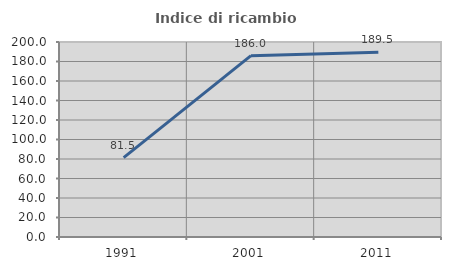
| Category | Indice di ricambio occupazionale  |
|---|---|
| 1991.0 | 81.457 |
| 2001.0 | 186 |
| 2011.0 | 189.516 |